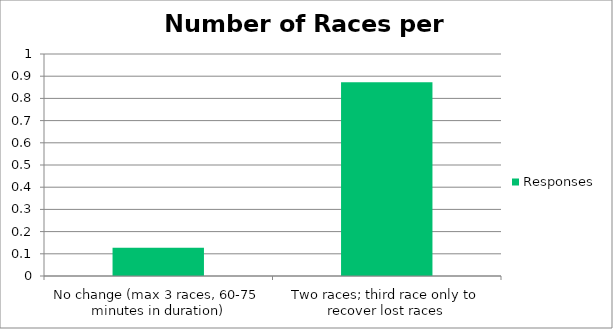
| Category | Responses |
|---|---|
| 2No change (max 3 races, 60-75 minutes in duration) | 0.128 |
| 0Two races; third race only to recover lost races | 0.872 |